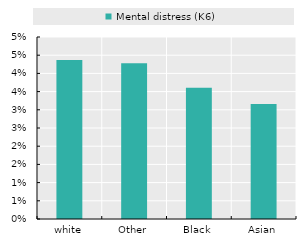
| Category | Mental distress (K6) |
|---|---|
| white | 0.044 |
| Other | 0.043 |
| Black | 0.036 |
| Asian | 0.032 |